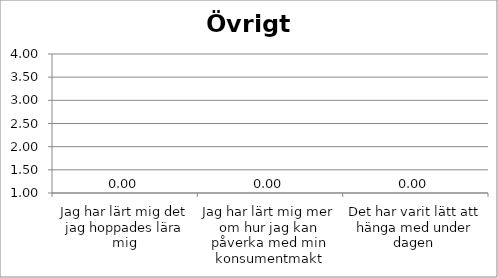
| Category | Series 0 |
|---|---|
| Jag har lärt mig det jag hoppades lära mig | 0 |
| Jag har lärt mig mer om hur jag kan påverka med min konsumentmakt | 0 |
| Det har varit lätt att hänga med under dagen  | 0 |